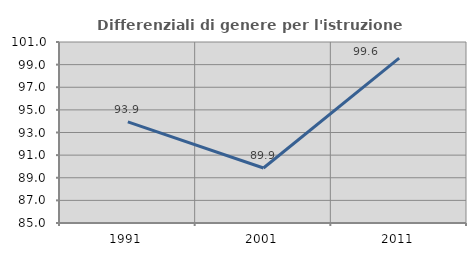
| Category | Differenziali di genere per l'istruzione superiore |
|---|---|
| 1991.0 | 93.939 |
| 2001.0 | 89.861 |
| 2011.0 | 99.582 |